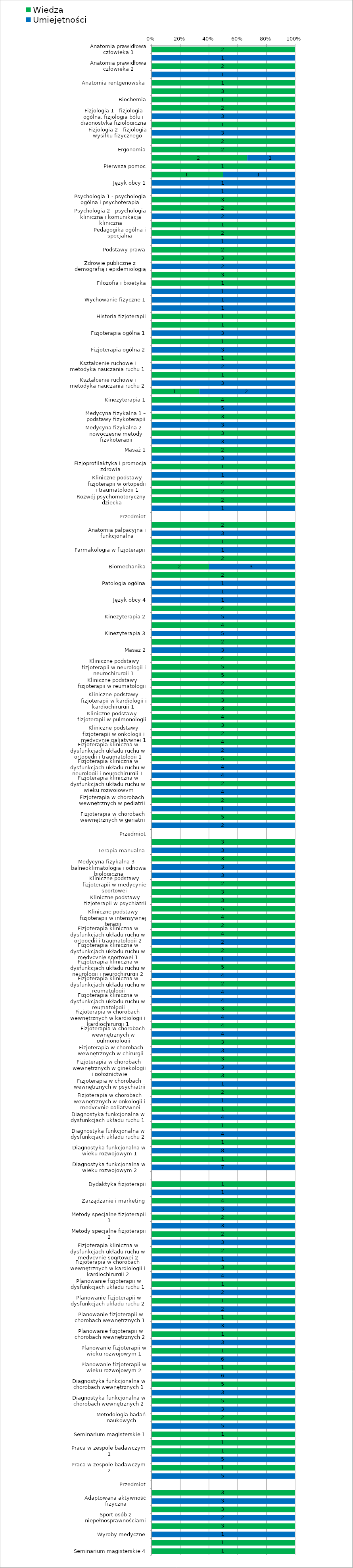
| Category | Wiedza | Umiejętności |
|---|---|---|
| Anatomia prawidłowa człowieka 1 | 2 | 0 |
| Anatomia prawidłowa człowieka 1 | 0 | 1 |
| Anatomia prawidłowa człowieka 2 | 2 | 0 |
| Anatomia prawidłowa człowieka 2 | 0 | 1 |
| Anatomia rentgenowska | 1 | 0 |
| Biologia medyczna z genetyką | 3 | 0 |
| Biochemia | 1 | 0 |
| Fizjologia 1 - fizjologia ogólna, fizjologia bólu i diagnostyka fizjologiczna | 2 | 0 |
| Fizjologia 1 - fizjologia ogólna, fizjologia bólu i diagnostyka fizjologiczna | 0 | 3 |
| Fizjologia 2 - fizjologia wysiłku fizycznego | 1 | 0 |
| Fizjologia 2 - fizjologia wysiłku fizycznego | 0 | 3 |
| Biofizyka | 2 | 0 |
| Ergonomia | 2 | 0 |
| Ergonomia | 2 | 1 |
| Pierwsza pomoc | 1 | 0 |
| Pierwsza pomoc | 1 | 1 |
| Język obcy 1 | 0 | 1 |
| Język obcy 2 | 0 | 1 |
| Psychologia 1 - psychologia ogólna i psychoterapia | 3 | 0 |
| Psychologia 2 - psychologia kliniczna i komunikacja kliniczna | 2 | 0 |
| Psychologia 2 - psychologia kliniczna i komunikacja kliniczna | 0 | 2 |
| Socjologia ogólna i niepełnosprawności | 1 | 0 |
| Pedagogika ogólna i specjalna | 2 | 0 |
| Pedagogika ogólna i specjalna | 0 | 1 |
| Podstawy prawa | 2 | 0 |
| Zdrowie publiczne z demografią i epidemiologią | 3 | 0 |
| Zdrowie publiczne z demografią i epidemiologią | 0 | 2 |
| Ekonomia, system ochrony zdrowia i technologie informacyjne | 3 | 0 |
| Filozofia i bioetyka | 1 | 0 |
| Filozofia i bioetyka | 0 | 1 |
| Wychowanie fizyczne 1 | 0 | 1 |
| Wychowanie fizyczne 2 | 0 | 1 |
| Historia fizjoterapii | 1 | 0 |
| Fizjoterapia ogólna 1 | 1 | 0 |
| Fizjoterapia ogólna 1 | 0 | 3 |
| Fizjoterapia ogólna 2 | 1 | 0 |
| Fizjoterapia ogólna 2 | 0 | 3 |
| Kształcenie ruchowe i metodyka nauczania ruchu 1 | 1 | 0 |
| Kształcenie ruchowe i metodyka nauczania ruchu 1 | 0 | 2 |
| Kształcenie ruchowe i metodyka nauczania ruchu 2 | 1 | 0 |
| Kształcenie ruchowe i metodyka nauczania ruchu 2 | 0 | 3 |
| Kształcenie ruchowe i metodyka nauczania ruchu 3 - pływanie | 1 | 2 |
| Kinezyterapia 1 | 4 | 0 |
| Kinezyterapia 1 | 0 | 5 |
| Medycyna fizykalna 1 – podstawy fizykoterapii | 3 | 0 |
| Medycyna fizykalna 1 – podstawy fizykoterapii | 0 | 3 |
| Medycyna fizykalna 2 – nowoczesne metody fizykoterapii | 3 | 0 |
| Medycyna fizykalna 2 – nowoczesne metody fizykoterapii | 0 | 3 |
| Masaż 1 | 2 | 0 |
| Masaż 1 | 0 | 3 |
| Fizjoprofilaktyka i promocja zdrowia | 1 | 0 |
| Fizjoprofilaktyka i promocja zdrowia | 0 | 1 |
| Kliniczne podstawy fizjoterapii w ortopedii i traumatologii 1 | 4 | 0 |
| Kliniczne podstawy fizjoterapii w pediatrii | 2 | 0 |
| Rozwój psychomotoryczny dziecka | 2 | 0 |
| Rozwój psychomotoryczny dziecka | 0 | 1 |
| Przedmiot | 0 | 0 |
| Anatomia palpacyjna i funkcjonalna | 2 | 0 |
| Anatomia palpacyjna i funkcjonalna | 0 | 3 |
| Farmakologia w fizjoterapii | 1 | 0 |
| Farmakologia w fizjoterapii | 0 | 1 |
| Biomechanika | 2 | 0 |
| Biomechanika | 2 | 3 |
| Patologia ogólna | 2 | 0 |
| Patologia ogólna | 0 | 1 |
| Język obcy 3 | 0 | 1 |
| Język obcy 4 | 0 | 1 |
| Kinezyterapia 2 | 4 | 0 |
| Kinezyterapia 2 | 0 | 5 |
| Kinezyterapia 3 | 4 | 0 |
| Kinezyterapia 3 | 0 | 5 |
| Masaż 2 | 2 | 0 |
| Masaż 2 | 0 | 3 |
| Kliniczne podstawy fizjoterapii w ortopedii i traumatologii 2 | 4 | 0 |
| Kliniczne podstawy fizjoterapii w neurologii i neurochirurgii 1 | 5 | 0 |
| Kliniczne podstawy fizjoterapii w neurologii i neurochirurgii 2 | 5 | 0 |
| Kliniczne podstawy fizjoterapii w reumatologii | 2 | 0 |
| Kliniczne podstawy fizjoterapii w neurologii dziecięcej | 2 | 0 |
| Kliniczne podstawy fizjoterapii w kardiologii i kardiochirurgii 1 | 3 | 0 |
| Kliniczne podstawy fizjoterapii w kardiologii i kardiochirurgii 2 | 3 | 0 |
| Kliniczne podstawy fizjoterapii w pulmonologii | 4 | 0 |
| Kliniczne podstawy fizjoterapii w ginekologii i położnictwie | 3 | 0 |
| Kliniczne podstawy fizjoterapii w onkologii i medycynie paliatywnej 1 | 2 | 0 |
| Fizjoterapia kliniczna w dysfunkcjach układu ruchu w ortopedii i traumatologii 1 | 4 | 0 |
| Fizjoterapia kliniczna w dysfunkcjach układu ruchu w ortopedii i traumatologii 1 | 0 | 2 |
| Fizjoterapia kliniczna w dysfunkcjach układu ruchu w neurologii i neurochirurgii 1 | 5 | 0 |
| Fizjoterapia kliniczna w dysfunkcjach układu ruchu w neurologii i neurochirurgii 1 | 0 | 4 |
| Fizjoterapia kliniczna w dysfunkcjach układu ruchu w neurologii i neurochirurgii 1 | 0 | 4 |
| Fizjoterapia kliniczna w dysfunkcjach układu ruchu w wieku rozwojowym | 2 | 0 |
| Fizjoterapia kliniczna w dysfunkcjach układu ruchu w wieku rozwojowym | 0 | 4 |
| Fizjoterapia w chorobach wewnętrznych w pediatrii | 2 | 0 |
| Fizjoterapia w chorobach wewnętrznych w pediatrii | 0 | 1 |
| Fizjoterapia w chorobach wewnętrznych w geriatrii | 5 | 0 |
| Fizjoterapia w chorobach wewnętrznych w geriatrii | 0 | 2 |
| Przedmiot | 0 | 0 |
| Terapia manualna | 3 | 0 |
| Terapia manualna | 0 | 3 |
| Medycyna fizykalna 3 – balneoklimatologia i odnowa biologiczna | 3 | 0 |
| Medycyna fizykalna 3 – balneoklimatologia i odnowa biologiczna | 0 | 3 |
| Medycyna fizykalna 3 – balneoklimatologia i odnowa biologiczna | 0 | 3 |
| Kliniczne podstawy fizjoterapii w medycynie sportowej | 2 | 0 |
| Kliniczne podstawy fizjoterapii w chirurgii | 3 | 0 |
| Kliniczne podstawy fizjoterapii w psychiatrii | 3 | 0 |
| Kliniczne podstawy fizjoterapii w geriatrii | 5 | 0 |
| Kliniczne podstawy fizjoterapii w intensywnej terapii | 4 | 0 |
| Kliniczne podstawy fizjoterapii w onkologii i medycynie paliatywnej 2 | 2 | 0 |
| Fizjoterapia kliniczna w dysfunkcjach układu ruchu w ortopedii i traumatologii 2 | 4 | 0 |
| Fizjoterapia kliniczna w dysfunkcjach układu ruchu w ortopedii i traumatologii 2 | 0 | 2 |
| Fizjoterapia kliniczna w dysfunkcjach układu ruchu w medycynie sportowej 1 | 2 | 0 |
| Fizjoterapia kliniczna w dysfunkcjach układu ruchu w medycynie sportowej 1 | 0 | 1 |
| Fizjoterapia kliniczna w dysfunkcjach układu ruchu w neurologii i neurochirurgii 2 | 5 | 0 |
| Fizjoterapia kliniczna w dysfunkcjach układu ruchu w neurologii i neurochirurgii 2 | 0 | 4 |
| Fizjoterapia kliniczna w dysfunkcjach układu ruchu w reumatologii | 2 | 0 |
| Fizjoterapia kliniczna w dysfunkcjach układu ruchu w reumatologii | 0 | 4 |
| Fizjoterapia kliniczna w dysfunkcjach układu ruchu w reumatologii | 0 | 4 |
| Fizjoterapia w chorobach wewnętrznych w kardiologii i kardiochirurgii 1 | 3 | 0 |
| Fizjoterapia w chorobach wewnętrznych w kardiologii i kardiochirurgii 1 | 0 | 4 |
| Fizjoterapia w chorobach wewnętrznych w pulmonologii | 4 | 0 |
| Fizjoterapia w chorobach wewnętrznych w pulmonologii | 0 | 4 |
| Fizjoterapia w chorobach wewnętrznych w chirurgii  | 3 | 0 |
| Fizjoterapia w chorobach wewnętrznych w chirurgii  | 0 | 3 |
| Fizjoterapia w chorobach wewnętrznych w ginekologii i położnictwie | 3 | 0 |
| Fizjoterapia w chorobach wewnętrznych w ginekologii i położnictwie | 0 | 3 |
| Fizjoterapia w chorobach wewnętrznych w psychiatrii | 3 | 0 |
| Fizjoterapia w chorobach wewnętrznych w psychiatrii | 0 | 1 |
| Fizjoterapia w chorobach wewnętrznych w onkologii i medycynie paliatywnej | 2 | 0 |
| Fizjoterapia w chorobach wewnętrznych w onkologii i medycynie paliatywnej | 0 | 1 |
| Diagnostyka funkcjonalna w dysfunkcjach układu ruchu 1 | 1 | 0 |
| Diagnostyka funkcjonalna w dysfunkcjach układu ruchu 1 | 0 | 4 |
| Diagnostyka funkcjonalna w dysfunkcjach układu ruchu 2 | 1 | 0 |
| Diagnostyka funkcjonalna w dysfunkcjach układu ruchu 2 | 0 | 4 |
| Diagnostyka funkcjonalna w wieku rozwojowym 1 | 1 | 0 |
| Diagnostyka funkcjonalna w wieku rozwojowym 1 | 0 | 8 |
| Diagnostyka funkcjonalna w wieku rozwojowym 2 | 1 | 0 |
| Diagnostyka funkcjonalna w wieku rozwojowym 2 | 0 | 7 |
| Przedmiot | 0 | 0 |
| Dydaktyka fizjoterapii | 1 | 0 |
| Dydaktyka fizjoterapii | 0 | 1 |
| Zarządzanie i marketing | 4 | 0 |
| Zarządzanie i marketing | 0 | 3 |
| Metody specjalne fizjoterapii 1 | 2 | 0 |
| Metody specjalne fizjoterapii 1 | 0 | 3 |
| Metody specjalne fizjoterapii 2 | 2 | 0 |
| Metody specjalne fizjoterapii 2 | 0 | 3 |
| Fizjoterapia kliniczna w dysfunkcjach układu ruchu w medycynie sportowej 2 | 2 | 0 |
| Fizjoterapia kliniczna w dysfunkcjach układu ruchu w medycynie sportowej 2 | 0 | 1 |
| Fizjoterapia w chorobach wewnętrznych w kardiologii i kardiochirurgii 2 | 3 | 0 |
| Fizjoterapia w chorobach wewnętrznych w kardiologii i kardiochirurgii 2 | 0 | 4 |
| Planowanie fizjoterapii w dysfunkcjach układu ruchu 1 | 1 | 0 |
| Planowanie fizjoterapii w dysfunkcjach układu ruchu 1 | 0 | 2 |
| Planowanie fizjoterapii w dysfunkcjach układu ruchu 2 | 1 | 0 |
| Planowanie fizjoterapii w dysfunkcjach układu ruchu 2 | 0 | 2 |
| Planowanie fizjoterapii w chorobach wewnętrznych 1 | 1 | 0 |
| Planowanie fizjoterapii w chorobach wewnętrznych 1 | 0 | 3 |
| Planowanie fizjoterapii w chorobach wewnętrznych 2 | 1 | 0 |
| Planowanie fizjoterapii w chorobach wewnętrznych 2 | 0 | 3 |
| Planowanie fizjoterapii w wieku rozwojowym 1 | 1 | 0 |
| Planowanie fizjoterapii w wieku rozwojowym 1 | 0 | 6 |
| Planowanie fizjoterapii w wieku rozwojowym 2 | 1 | 0 |
| Planowanie fizjoterapii w wieku rozwojowym 2 | 0 | 6 |
| Diagnostyka funkcjonalna w chorobach wewnętrznych 1 | 5 | 0 |
| Diagnostyka funkcjonalna w chorobach wewnętrznych 1 | 0 | 3 |
| Diagnostyka funkcjonalna w chorobach wewnętrznych 2 | 5 | 0 |
| Diagnostyka funkcjonalna w chorobach wewnętrznych 2 | 0 | 3 |
| Metodologia badań naukowych | 2 | 0 |
| Metodologia badań naukowych | 0 | 5 |
| Seminarium magisterskie 1 | 1 | 0 |
| Seminarium magisterskie 2 | 1 | 0 |
| Praca w zespole badawczym 1 | 1 | 0 |
| Praca w zespole badawczym 1 | 0 | 5 |
| Praca w zespole badawczym 2 | 1 | 0 |
| Praca w zespole badawczym 2 | 0 | 5 |
| Przedmiot | 0 | 0 |
| Adaptowana aktywność fizyczna | 3 | 0 |
| Adaptowana aktywność fizyczna | 0 | 3 |
| Sport osób z niepełnosprawnościami | 3 | 0 |
| Sport osób z niepełnosprawnościami | 0 | 2 |
| Wyroby medyczne | 3 | 0 |
| Wyroby medyczne | 0 | 1 |
| Seminarium magisterskie 3 | 1 | 0 |
| Seminarium magisterskie 4 | 1 | 0 |